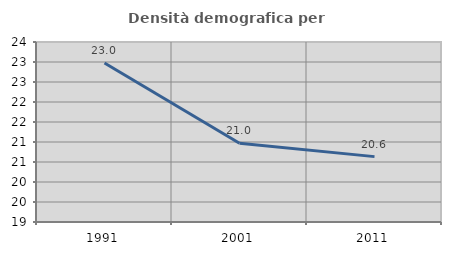
| Category | Densità demografica |
|---|---|
| 1991.0 | 22.977 |
| 2001.0 | 20.969 |
| 2011.0 | 20.634 |